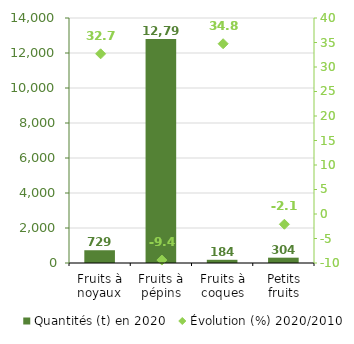
| Category | Quantités (t) en 2020 |
|---|---|
| Fruits à noyaux | 729 |
| Fruits à pépins | 12796 |
| Fruits à coques | 183.8 |
| Petits fruits | 304.1 |